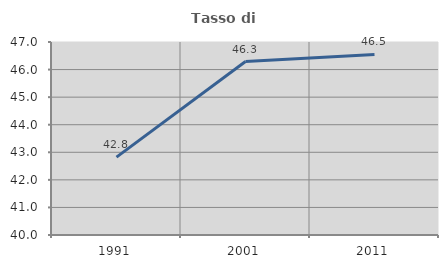
| Category | Tasso di occupazione   |
|---|---|
| 1991.0 | 42.825 |
| 2001.0 | 46.291 |
| 2011.0 | 46.55 |